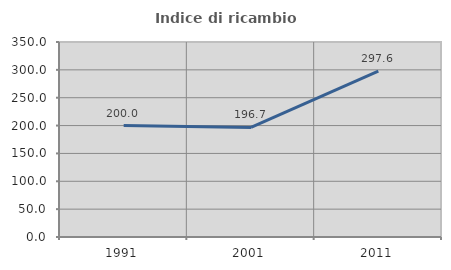
| Category | Indice di ricambio occupazionale  |
|---|---|
| 1991.0 | 200 |
| 2001.0 | 196.667 |
| 2011.0 | 297.647 |